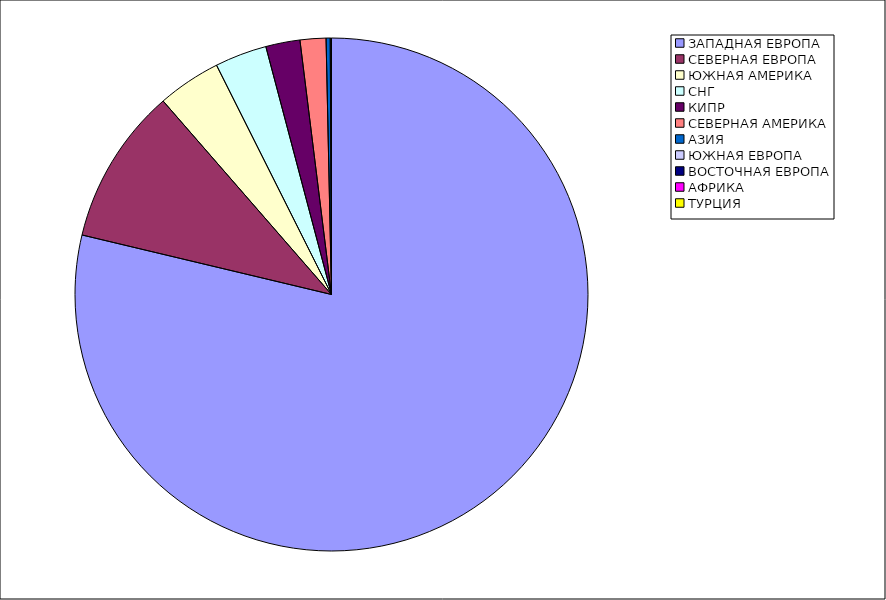
| Category | Оборот |
|---|---|
| ЗАПАДНАЯ ЕВРОПА | 0.787 |
| СЕВЕРНАЯ ЕВРОПА | 0.099 |
| ЮЖНАЯ АМЕРИКА | 0.04 |
| СНГ | 0.033 |
| КИПР | 0.022 |
| СЕВЕРНАЯ АМЕРИКА | 0.016 |
| АЗИЯ | 0.003 |
| ЮЖНАЯ ЕВРОПА | 0.001 |
| ВОСТОЧНАЯ ЕВРОПА | 0 |
| АФРИКА | 0 |
| ТУРЦИЯ | 0 |